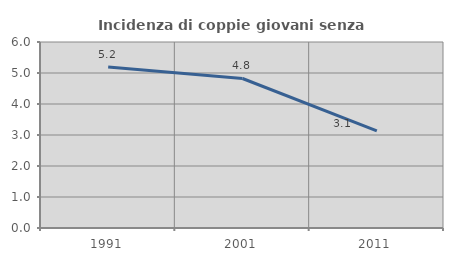
| Category | Incidenza di coppie giovani senza figli |
|---|---|
| 1991.0 | 5.193 |
| 2001.0 | 4.823 |
| 2011.0 | 3.135 |